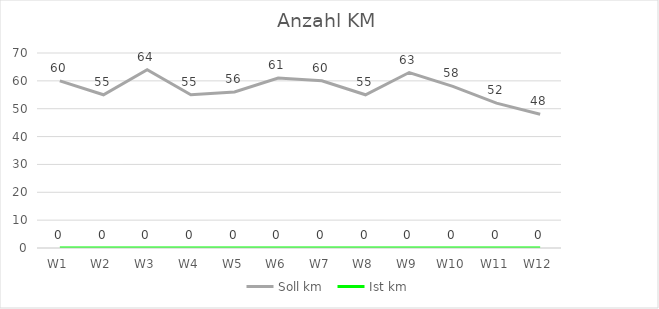
| Category | Soll km | Ist km |
|---|---|---|
| W1 | 60 | 0 |
| W2 | 55 | 0 |
| W3 | 64 | 0 |
| W4 | 55 | 0 |
| W5 | 56 | 0 |
| W6 | 61 | 0 |
| W7 | 60 | 0 |
| W8 | 55 | 0 |
| W9 | 63 | 0 |
| W10 | 58 | 0 |
| W11 | 52 | 0 |
| W12 | 48 | 0 |